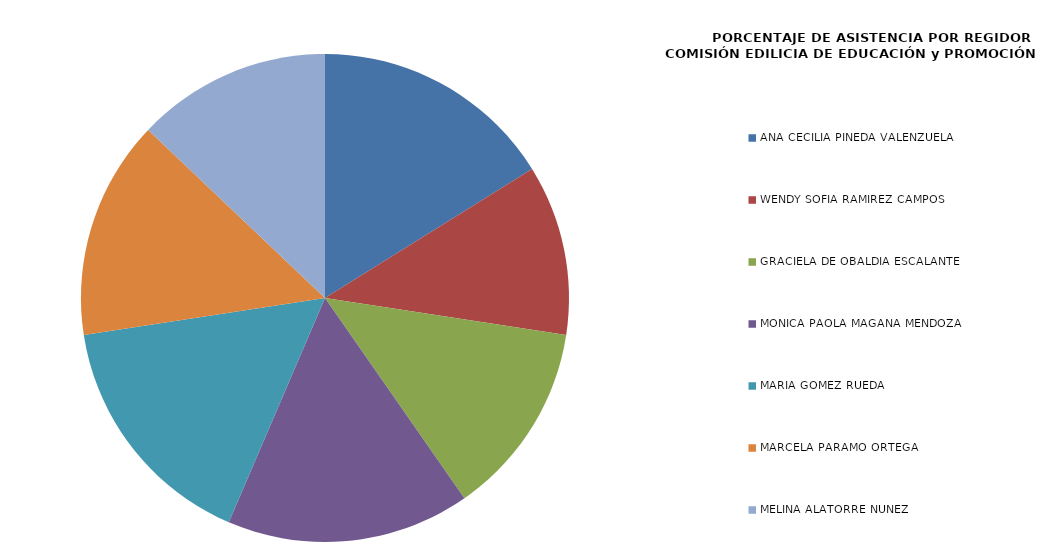
| Category | Series 0 |
|---|---|
| ANA CECILIA PINEDA VALENZUELA | 100 |
| WENDY SOFÍA RAMÍREZ CAMPOS | 70 |
| GRACIELA DE OBALDÍA ESCALANTE | 80 |
| MÓNICA PAOLA MAGAÑA MENDOZA | 100 |
| MARÍA GÓMEZ RUEDA | 100 |
| MARCELA PÁRAMO ORTEGA | 90 |
| MELINA ALATORRE NÚÑEZ | 80 |